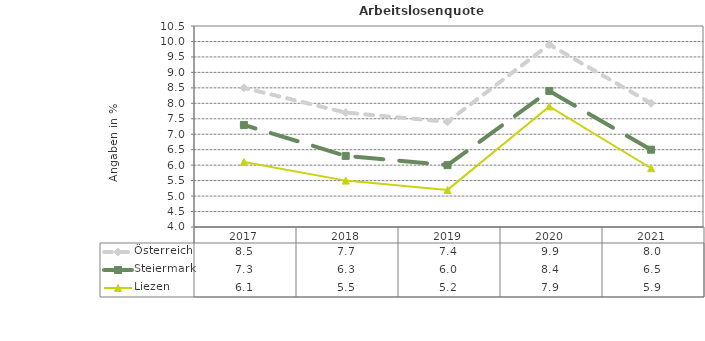
| Category | Österreich | Steiermark | Liezen |
|---|---|---|---|
| 2021.0 | 8 | 6.5 | 5.9 |
| 2020.0 | 9.9 | 8.4 | 7.9 |
| 2019.0 | 7.4 | 6 | 5.2 |
| 2018.0 | 7.7 | 6.3 | 5.5 |
| 2017.0 | 8.5 | 7.3 | 6.1 |